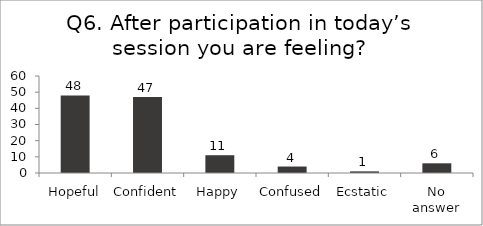
| Category | Q6. After participation in today’s session you are feeling? |
|---|---|
| Hopeful | 48 |
| Confident | 47 |
| Happy | 11 |
| Confused | 4 |
| Ecstatic | 1 |
| No answer | 6 |